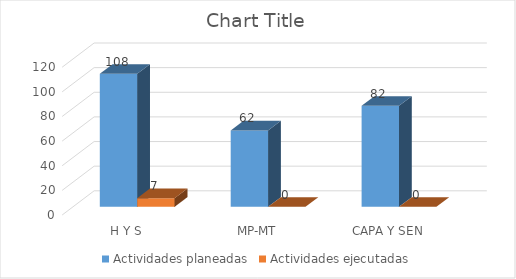
| Category | Actividades planeadas | Actividades ejecutadas |
|---|---|---|
| H Y S | 108 | 7 |
| MP-MT | 62 | 0 |
| CAPA Y SEN | 82 | 0 |